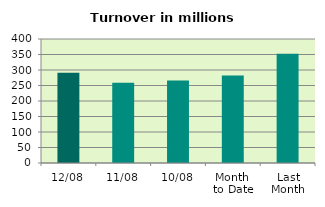
| Category | Series 0 |
|---|---|
| 12/08 | 291.397 |
| 11/08 | 258.672 |
| 10/08 | 266.147 |
| Month 
to Date | 282.456 |
| Last
Month | 352.063 |